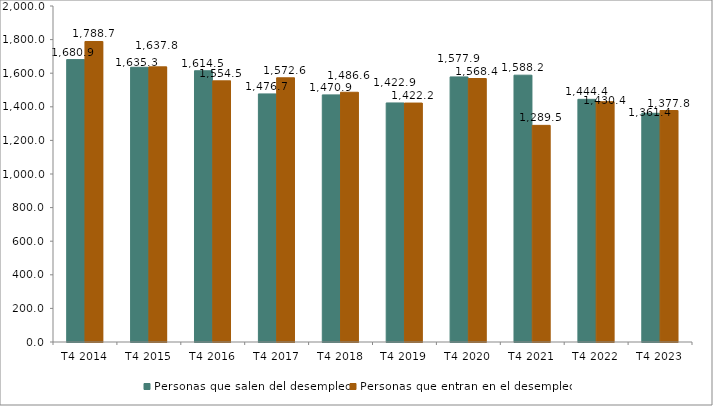
| Category | Personas que salen del desempleo | Personas que entran en el desempleo |
|---|---|---|
| T4 2014 | 1680.9 | 1788.7 |
| T4 2015 | 1635.3 | 1637.8 |
| T4 2016 | 1614.5 | 1554.5 |
| T4 2017 | 1476.7 | 1572.6 |
| T4 2018 | 1470.9 | 1486.6 |
| T4 2019 | 1422.9 | 1422.2 |
| T4 2020 | 1577.9 | 1568.4 |
| T4 2021 | 1588.2 | 1289.5 |
| T4 2022 | 1444.4 | 1430.4 |
| T4 2023 | 1361.4 | 1377.8 |